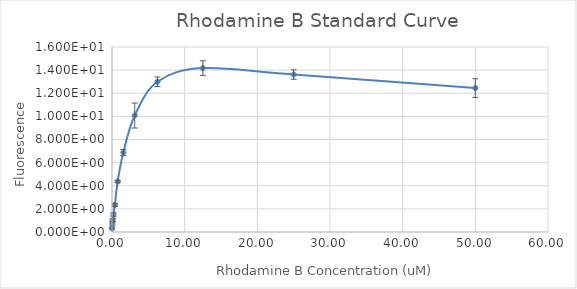
| Category | Series 0 |
|---|---|
| 50.0 | 12.449 |
| 25.0 | 13.616 |
| 12.5 | 14.174 |
| 6.25 | 12.994 |
| 3.125 | 10.075 |
| 1.5625 | 6.872 |
| 0.78125 | 4.368 |
| 0.390625 | 2.345 |
| 0.1953125 | 1.495 |
| 0.09765625 | 1.009 |
| 0.048828125 | 0.708 |
| 0.0 | 0.307 |